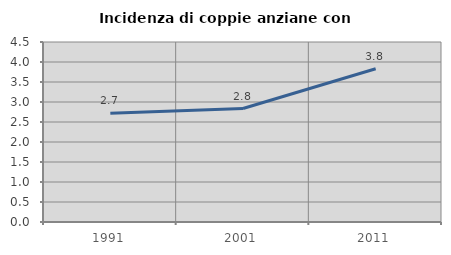
| Category | Incidenza di coppie anziane con figli |
|---|---|
| 1991.0 | 2.722 |
| 2001.0 | 2.836 |
| 2011.0 | 3.832 |